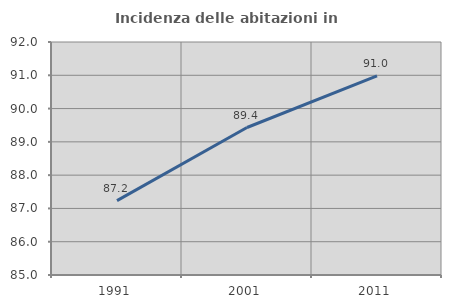
| Category | Incidenza delle abitazioni in proprietà  |
|---|---|
| 1991.0 | 87.234 |
| 2001.0 | 89.431 |
| 2011.0 | 90.98 |